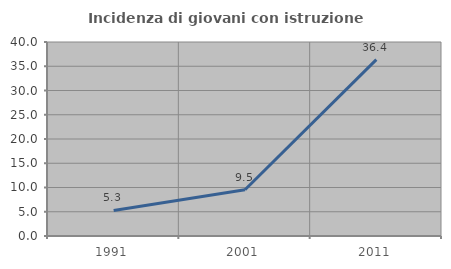
| Category | Incidenza di giovani con istruzione universitaria |
|---|---|
| 1991.0 | 5.263 |
| 2001.0 | 9.524 |
| 2011.0 | 36.364 |